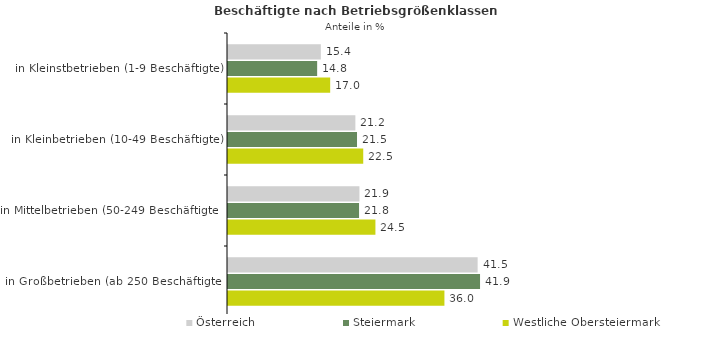
| Category | Österreich | Steiermark | Westliche Obersteiermark |
|---|---|---|---|
| in Kleinstbetrieben (1-9 Beschäftigte) | 15.439 | 14.827 | 16.995 |
| in Kleinbetrieben (10-49 Beschäftigte) | 21.184 | 21.458 | 22.492 |
| in Mittelbetrieben (50-249 Beschäftigte) | 21.859 | 21.796 | 24.519 |
| in Großbetrieben (ab 250 Beschäftigte) | 41.518 | 41.919 | 35.995 |